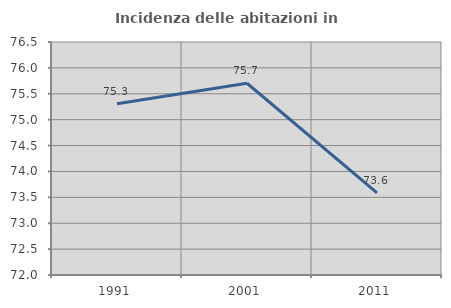
| Category | Incidenza delle abitazioni in proprietà  |
|---|---|
| 1991.0 | 75.308 |
| 2001.0 | 75.703 |
| 2011.0 | 73.586 |